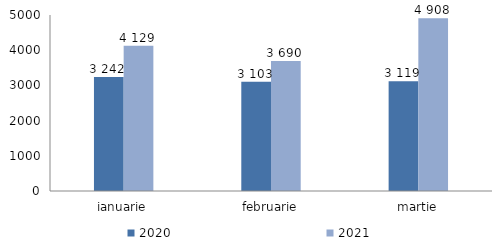
| Category | 2020 | 2021 |
|---|---|---|
| ianuarie | 3242 | 4129 |
| februarie | 3103 | 3690 |
| martie | 3119 | 4908 |